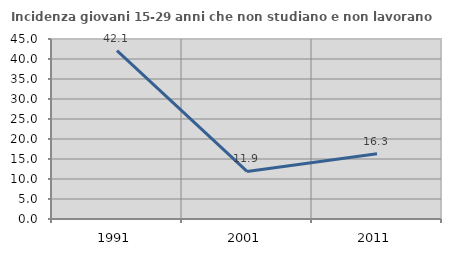
| Category | Incidenza giovani 15-29 anni che non studiano e non lavorano  |
|---|---|
| 1991.0 | 42.105 |
| 2001.0 | 11.902 |
| 2011.0 | 16.3 |